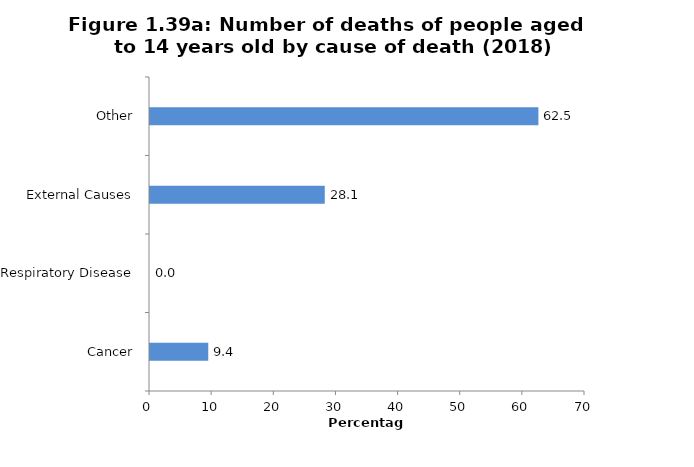
| Category | Percentage |
|---|---|
| Cancer | 9.375 |
| Respiratory Disease | 0 |
| External Causes | 28.125 |
| Other | 62.5 |